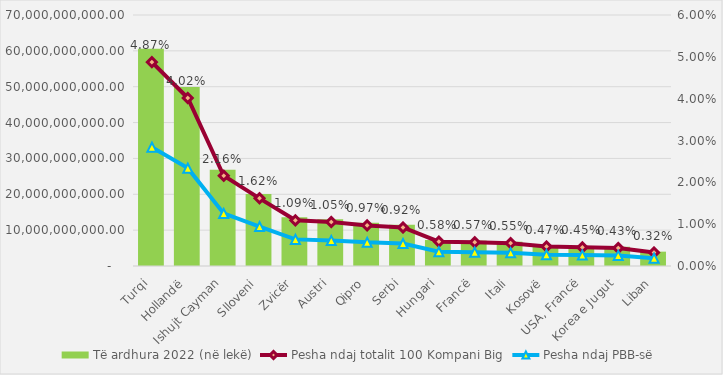
| Category | Të ardhura 2022 (në lekë) |
|---|---|
| Turqi | 60603572962 |
| Hollandë | 49928520788 |
| Ishujt Cayman | 26829000000 |
| Slloveni | 20114011888 |
| Zvicër | 13584176000 |
| Austri | 13062458000 |
| Qipro | 12056748000 |
| Serbi | 11474876424 |
| Hungari | 7239471000 |
| Francë | 7074191064 |
| Itali | 6777726000 |
| Kosovë | 5792772756 |
| USA, Francë | 5554972201 |
| Korea e Jugut | 5365678864 |
| Liban | 4000000000 |